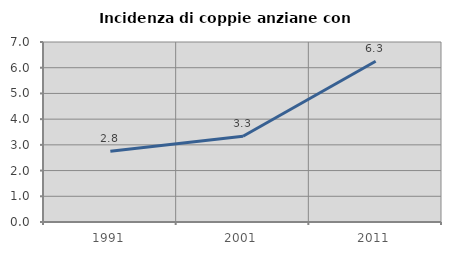
| Category | Incidenza di coppie anziane con figli |
|---|---|
| 1991.0 | 2.752 |
| 2001.0 | 3.333 |
| 2011.0 | 6.25 |